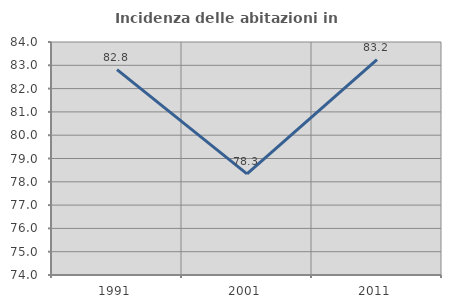
| Category | Incidenza delle abitazioni in proprietà  |
|---|---|
| 1991.0 | 82.811 |
| 2001.0 | 78.343 |
| 2011.0 | 83.247 |